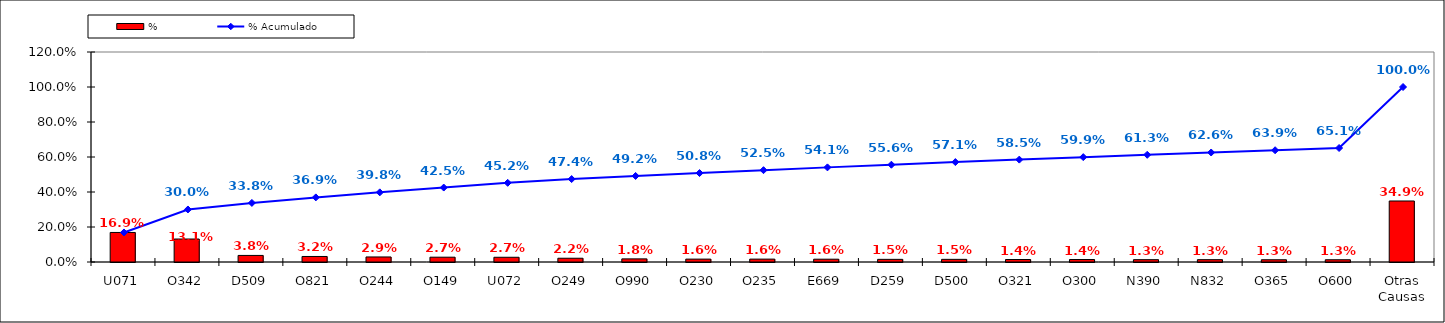
| Category | % |
|---|---|
| U071 | 0.169 |
| O342 | 0.131 |
| D509 | 0.038 |
| O821 | 0.032 |
| O244 | 0.029 |
| O149 | 0.027 |
| U072 | 0.027 |
| O249 | 0.022 |
| O990 | 0.018 |
| O230 | 0.016 |
| O235 | 0.016 |
| E669 | 0.016 |
| D259 | 0.015 |
| D500 | 0.015 |
| O321 | 0.014 |
| O300 | 0.014 |
| N390 | 0.013 |
| N832 | 0.013 |
| O365 | 0.013 |
| O600 | 0.013 |
| Otras Causas | 0.349 |